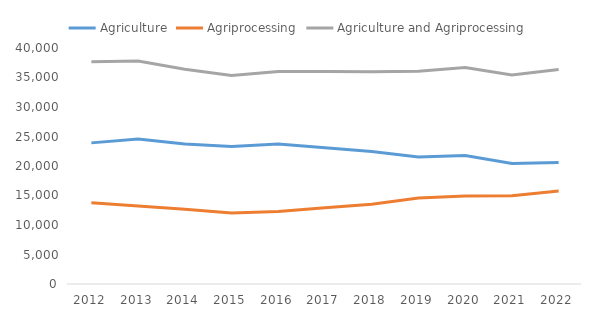
| Category | Agriculture | Agriprocessing | Agriculture and Agriprocessing |
|---|---|---|---|
| 2012 | 23920 | 13770 | 37690 |
| 2013 | 24585 | 13200 | 37785 |
| 2014 | 23740 | 12655 | 36395 |
| 2015 | 23310 | 12040 | 35350 |
| 2016 | 23735 | 12280 | 36015 |
| 2017 | 23100 | 12930 | 36030 |
| 2018 | 22470 | 13505 | 35975 |
| 2019 | 21515 | 14560 | 36075 |
| 2020 | 21785 | 14905 | 36690 |
| 2021 | 20440 | 14975 | 35415 |
| 2022 | 20590 | 15775 | 36365 |